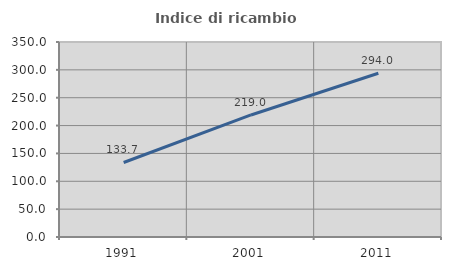
| Category | Indice di ricambio occupazionale  |
|---|---|
| 1991.0 | 133.725 |
| 2001.0 | 219.048 |
| 2011.0 | 293.96 |